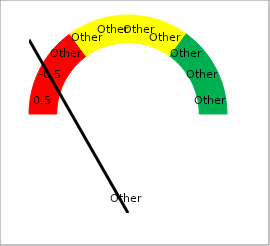
| Category | Series 0 |
|---|---|
| 0.0 | 0 |
| nan | 1 |
| 1.0 | 0 |
| nan | 1 |
| 2.0 | 0 |
| nan | 1 |
| 3.0 | 0 |
| nan | 1 |
| 4.0 | 0 |
| nan | 1 |
| 5.0 | 0 |
| nan | 1 |
| 6.0 | 0 |
| nan | 1 |
| 7.0 | 0 |
| nan | 1 |
| 8.0 | 0 |
| nan | 1 |
| 9.0 | 0 |
| nan | 1 |
| 10.0 | 0 |
| nan | 10 |